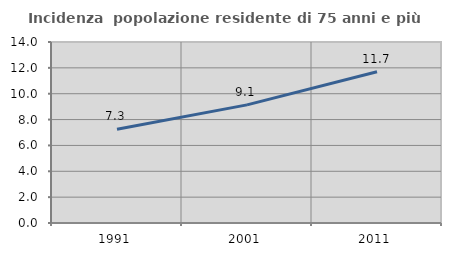
| Category | Incidenza  popolazione residente di 75 anni e più |
|---|---|
| 1991.0 | 7.255 |
| 2001.0 | 9.135 |
| 2011.0 | 11.699 |